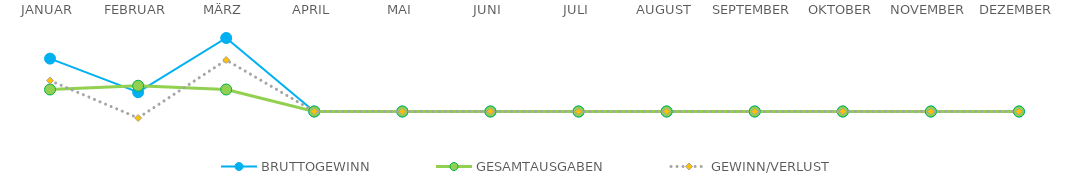
| Category | BRUTTOGEWINN | GESAMTAUSGABEN | GEWINN/VERLUST |
|---|---|---|---|
| JANUAR | 192300 | 80000 | 112300 |
| FEBRUAR | 70100 | 93600 | -23500 |
| MÄRZ | 267300 | 80000 | 187300 |
| APRIL | 0 | 0 | 0 |
| MAI | 0 | 0 | 0 |
| JUNI | 0 | 0 | 0 |
| JULI | 0 | 0 | 0 |
| AUGUST | 0 | 0 | 0 |
| SEPTEMBER | 0 | 0 | 0 |
| OKTOBER | 0 | 0 | 0 |
| NOVEMBER | 0 | 0 | 0 |
| DEZEMBER | 0 | 0 | 0 |